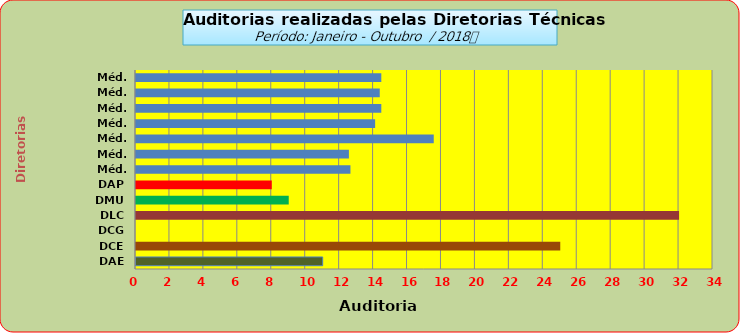
| Category | Series 0 |
|---|---|
| DAE | 11 |
| DCE | 25 |
| DCG | 0 |
| DLC | 32 |
| DMU | 9 |
| DAP | 8 |
| Méd. 2011 | 12.636 |
| Méd. 2012 | 12.545 |
| Méd. 2013 | 17.545 |
| Méd. 2014 | 14.091 |
| Méd. 2015 | 14.455 |
| Méd. 2016 | 14.364 |
| Méd. 2017 | 14.455 |